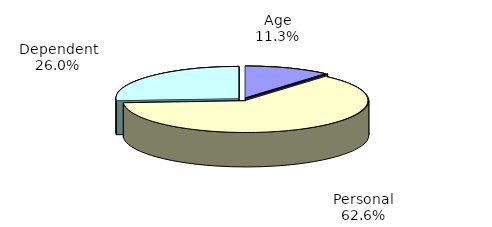
| Category | Series 0 |
|---|---|
| Age | 989820 |
| Blindness | 8846 |
| Personal | 5507452 |
| Dependent | 2288784 |